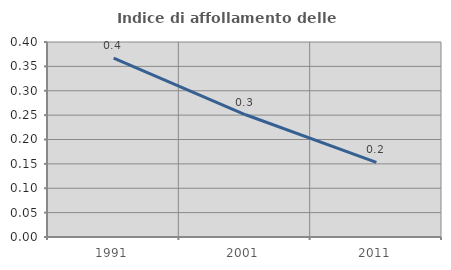
| Category | Indice di affollamento delle abitazioni  |
|---|---|
| 1991.0 | 0.367 |
| 2001.0 | 0.251 |
| 2011.0 | 0.153 |